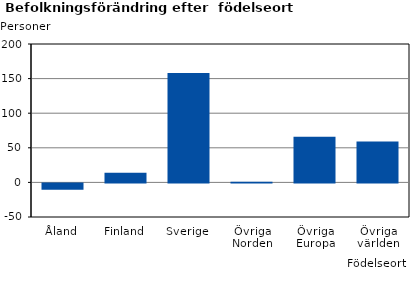
| Category | Series 0 |
|---|---|
| Åland | -9 |
| Finland | 14 |
| Sverige | 158 |
| Övriga Norden | 1 |
| Övriga Europa | 66 |
| Övriga världen | 59 |